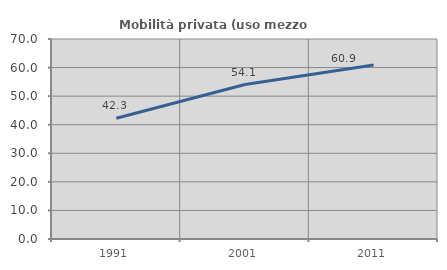
| Category | Mobilità privata (uso mezzo privato) |
|---|---|
| 1991.0 | 42.28 |
| 2001.0 | 54.054 |
| 2011.0 | 60.88 |